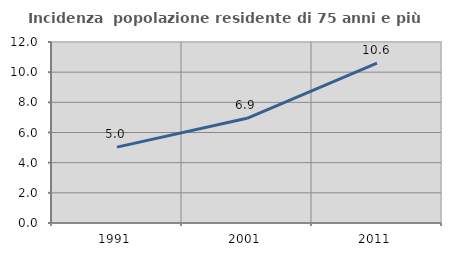
| Category | Incidenza  popolazione residente di 75 anni e più |
|---|---|
| 1991.0 | 5.031 |
| 2001.0 | 6.942 |
| 2011.0 | 10.595 |